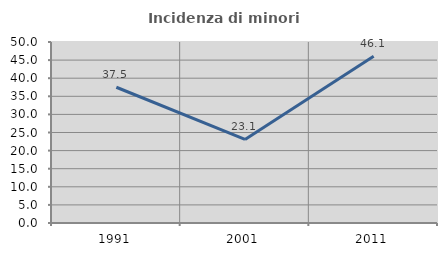
| Category | Incidenza di minori stranieri |
|---|---|
| 1991.0 | 37.5 |
| 2001.0 | 23.077 |
| 2011.0 | 46.053 |